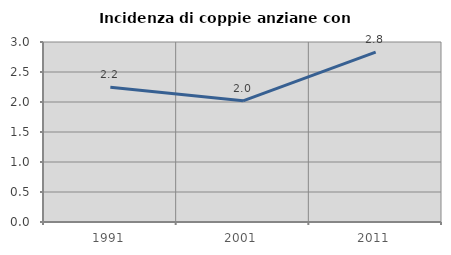
| Category | Incidenza di coppie anziane con figli |
|---|---|
| 1991.0 | 2.247 |
| 2001.0 | 2.02 |
| 2011.0 | 2.83 |